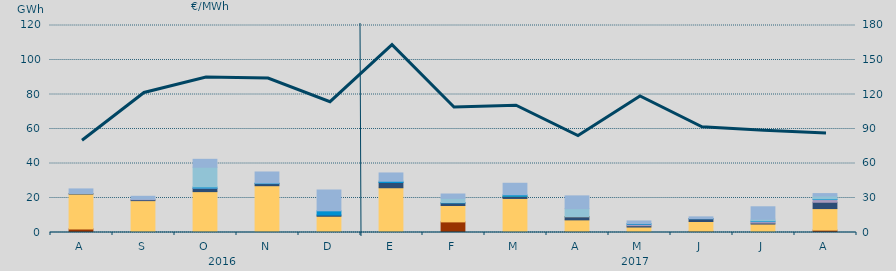
| Category | Carbón | Ciclo Combinado | Cogeneración | Consumo Bombeo | Enlace Península Baleares | Eólica | Hidráulica | Internacionales | Otras Renovables | Residuos no Renovables | Solar fotovoltaica | Turbinación bombeo |
|---|---|---|---|---|---|---|---|---|---|---|---|---|
| A | 2091.8 | 20206 | 0 | 273.8 | 0 | 0 | 0 | 0 | 0 | 0 | 0 | 2688.1 |
| S | 456.3 | 18024.6 | 0 | 521.1 | 279.8 | 0 | 0 | 0 | 0 | 0 | 0 | 1707.9 |
| O | 53.4 | 23642.3 | 0 | 1821.5 | 200.8 | 0 | 661 | 11465.7 | 0 | 0 | 0 | 4580.4 |
| N | 0 | 27130.5 | 0 | 1183.5 | 0 | 0 | 312.1 | 0 | 0 | 0 | 0 | 6456 |
| D | 0 | 9410.5 | 0 | 701.1 | 0 | 0 | 2449.9 | 0 | 0 | 0 | 0 | 12070.5 |
| E | 0 | 25945.3 | 0 | 3031.3 | 0 | 0 | 733.3 | 0 | 0 | 0 | 0 | 4804 |
| F | 6150 | 9508.4 | 0 | 1469.4 | 0 | 0 | 198 | 2463.6 | 0 | 0 | 0 | 2519.7 |
| M | 0 | 19740.7 | 0 | 1177.9 | 20.4 | 43.7 | 849.6 | 0 | 0 | 0 | 0 | 6709.7 |
| A | 610 | 6714.7 | 0 | 1740 | 132.6 | 93.7 | 0 | 4549.7 | 0 | 0 | 0 | 7385.9 |
| M | 70 | 3116.9 | 0 | 762.7 | 846.6 | 0 | 410 | 0 | 0 | 0 | 0 | 1489.3 |
| J | 673.2 | 5702.5 | 0 | 1567.6 | 28.4 | 0 | 149.4 | 0 | 0 | 0 | 0 | 940.1 |
| J | 0 | 4906.7 | 0 | 593.2 | 844.1 | 0 | 376.7 | 973.2 | 0 | 0 | 0 | 7214.8 |
| A | 1372.5 | 12488.5 | 0 | 3675.7 | 1561.2 | 0 | 359.5 | 1700.4 | 0 | 0 | 0 | 1397.9 |